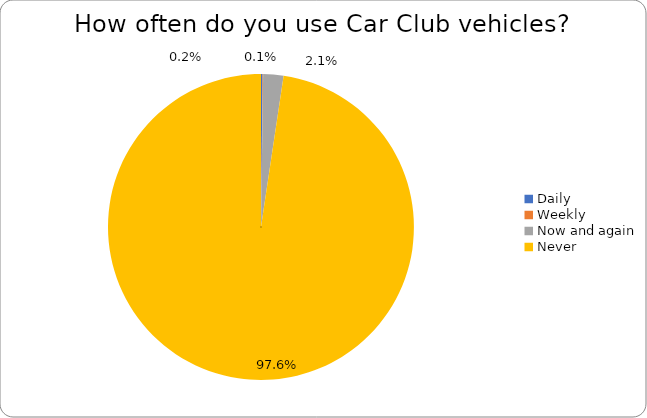
| Category | Series 0 |
|---|---|
| Daily | 0.002 |
| Weekly | 0.001 |
| Now and again | 0.021 |
| Never | 0.976 |